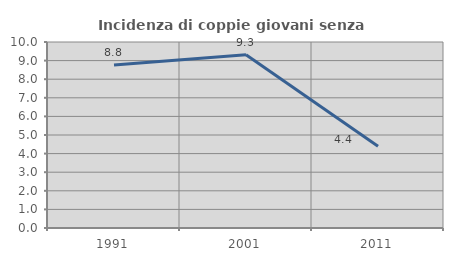
| Category | Incidenza di coppie giovani senza figli |
|---|---|
| 1991.0 | 8.758 |
| 2001.0 | 9.314 |
| 2011.0 | 4.397 |